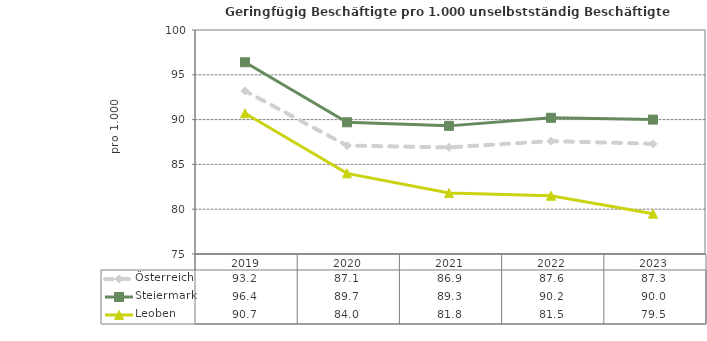
| Category | Österreich | Steiermark | Leoben |
|---|---|---|---|
| 2023.0 | 87.3 | 90 | 79.5 |
| 2022.0 | 87.6 | 90.2 | 81.5 |
| 2021.0 | 86.9 | 89.3 | 81.8 |
| 2020.0 | 87.1 | 89.7 | 84 |
| 2019.0 | 93.2 | 96.4 | 90.7 |